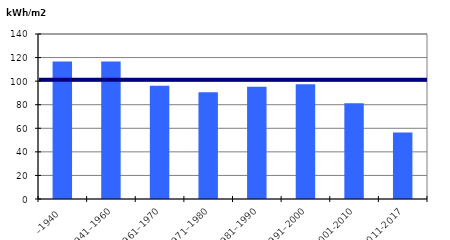
| Category | Byggårskategori |
|---|---|
| –1940 | 116.637 |
| 1941–1960 | 116.711 |
| 1961–1970 | 95.988 |
| 1971–1980 | 90.579 |
| 1981–1990 | 95.3 |
| 1991–2000 | 97.31 |
| 2001-2010 | 81.341 |
| 2011-2017 | 56.385 |